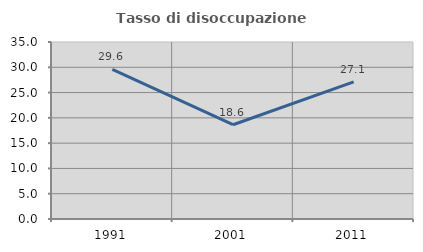
| Category | Tasso di disoccupazione giovanile  |
|---|---|
| 1991.0 | 29.592 |
| 2001.0 | 18.644 |
| 2011.0 | 27.119 |